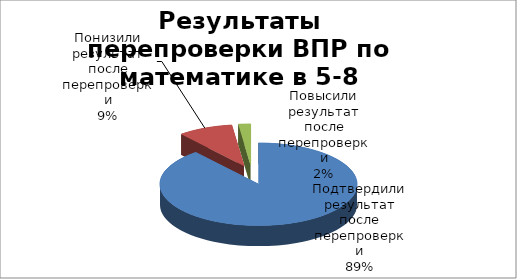
| Category | Series 0 |
|---|---|
| Подтвердили результат после перепроверки | 89 |
| Понизили результат после перепроверки | 9 |
| Повысили результат после перепроверки | 2 |